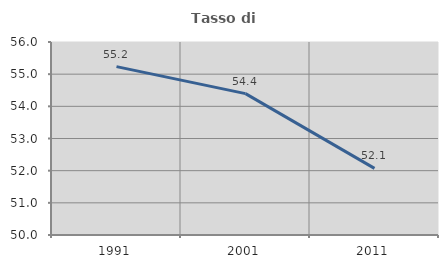
| Category | Tasso di occupazione   |
|---|---|
| 1991.0 | 55.234 |
| 2001.0 | 54.395 |
| 2011.0 | 52.07 |